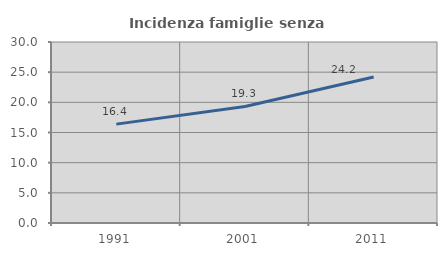
| Category | Incidenza famiglie senza nuclei |
|---|---|
| 1991.0 | 16.387 |
| 2001.0 | 19.313 |
| 2011.0 | 24.202 |